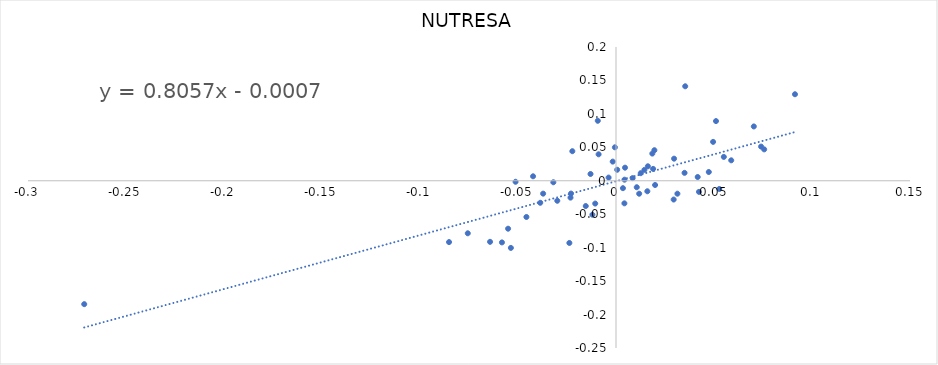
| Category | NUTRESA |
|---|---|
| 0.07031166163327263 | 0.081 |
| -0.064260393167902 | -0.091 |
| 0.018926696361604822 | 0.018 |
| -0.010598264919067013 | -0.034 |
| -0.053634872916097365 | -0.1 |
| -0.0222767710313736 | 0.044 |
| -0.0005661213304670731 | 0.05 |
| -0.0851879520248251 | -0.092 |
| 0.03531174844753959 | 0.141 |
| 0.018531520052699424 | 0.041 |
| 0.05878698652869163 | 0.031 |
| 0.07402525378364677 | 0.051 |
| 0.004602363294843093 | 0.02 |
| -0.03717912426811287 | -0.019 |
| 0.015992139325808008 | -0.016 |
| -0.0037770907263284803 | 0.005 |
| 0.05500603873966159 | 0.036 |
| -0.029959860308075847 | -0.03 |
| 0.01994278586527054 | -0.006 |
| -0.05818986034726448 | -0.092 |
| 0.051015885604982714 | 0.089 |
| 0.0042835582386362425 | -0.034 |
| -0.022954466765379822 | -0.019 |
| 0.029631081722975683 | 0.033 |
| 0.004342381792751926 | 0.002 |
| 0.04953555856919967 | 0.058 |
| 0.01626976408147396 | 0.022 |
| 0.012625606671679446 | 0.011 |
| 0.0006075457178154053 | 0.016 |
| 0.003541864842437681 | -0.011 |
| -0.04231203614069057 | 0.007 |
| 0.014495500428196362 | 0.016 |
| 0.047341945572677124 | 0.013 |
| 0.029418954183595858 | -0.028 |
| -0.05124568406730934 | -0.001 |
| -0.015429572558224414 | -0.038 |
| 0.0756018467626689 | 0.047 |
| -0.012040420041390831 | -0.051 |
| 0.01958996838450644 | 0.046 |
| -0.03196555506940357 | -0.002 |
| 0.010592165596750913 | -0.01 |
| -0.023788380640017648 | -0.093 |
| -0.07562065508243299 | -0.079 |
| -0.009294775100920916 | 0.09 |
| -0.03865172123778304 | -0.033 |
| 0.09131703785267686 | 0.129 |
| 0.04233557473687122 | -0.017 |
| 0.052689505194693176 | -0.012 |
| -0.00888054719286524 | 0.04 |
| -0.05505706514831865 | -0.072 |
| 0.041681237390719605 | 0.006 |
| 0.008489457578535697 | 0.004 |
| -0.0016707956444086403 | 0.029 |
| 0.011824151020827012 | -0.019 |
| 0.03497553803645226 | 0.012 |
| -0.01299941830205431 | 0.01 |
| 0.0313290982182739 | -0.019 |
| -0.02321314709880784 | -0.025 |
| -0.04570675501745869 | -0.054 |
| -0.27131342724943686 | -0.184 |